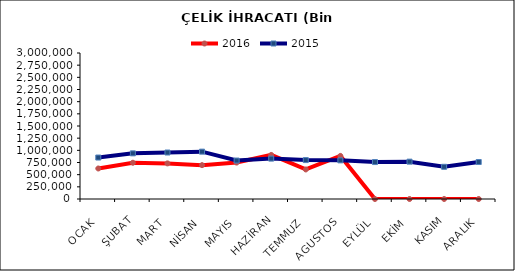
| Category | 2016 | 2015 |
|---|---|---|
| OCAK | 626933.284 | 851959.678 |
| ŞUBAT | 744942.984 | 937971.255 |
| MART | 731714.538 | 954845.981 |
| NİSAN | 695906.026 | 973028.221 |
| MAYIS | 748658.196 | 790369.949 |
| HAZİRAN | 905415.067 | 830151.848 |
| TEMMUZ | 606976.592 | 799547.273 |
| AGUSTOS | 885267.084 | 793980.146 |
| EYLÜL | 0 | 759077.655 |
| EKİM | 0 | 767523.089 |
| KASIM | 0 | 661539.253 |
| ARALIK | 0 | 759979.025 |